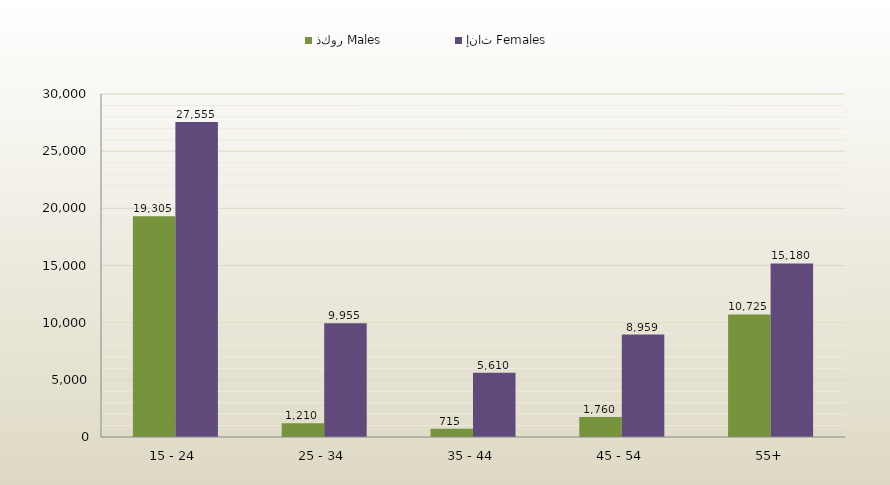
| Category | ذكور Males | إناث Females |
|---|---|---|
| 15 - 24 | 19305 | 27555 |
| 25 - 34 | 1210 | 9955 |
| 35 - 44 | 715 | 5610 |
| 45 - 54 | 1760 | 8959 |
| 55+ | 10725 | 15180 |